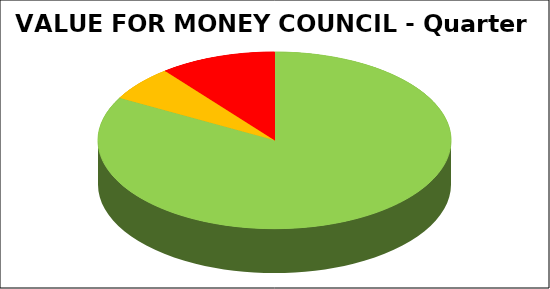
| Category | Series 0 |
|---|---|
| Green | 0.83 |
| Amber | 0.064 |
| Red | 0.106 |